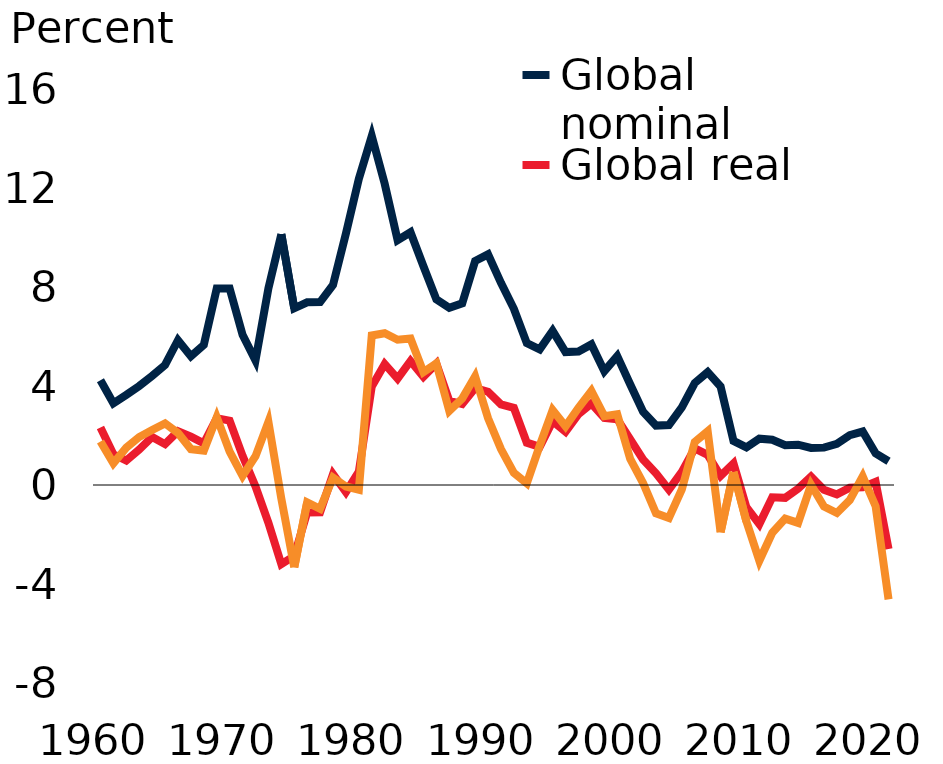
| Category | Global nominal | Global real | U.S. real |
|---|---|---|---|
| 1960.0 | 4.23 | 2.32 | 1.76 |
| 1961.0 | 3.3 | 1.24 | 0.88 |
| 1962.0 | 3.64 | 0.99 | 1.51 |
| 1963.0 | 4 | 1.43 | 1.94 |
| 1964.0 | 4.41 | 1.94 | 2.22 |
| 1965.0 | 4.85 | 1.65 | 2.49 |
| 1966.0 | 5.85 | 2.17 | 2.1 |
| 1967.0 | 5.2 | 1.95 | 1.45 |
| 1968.0 | 5.66 | 1.68 | 1.39 |
| 1969.0 | 7.94 | 2.7 | 2.74 |
| 1970.0 | 7.94 | 2.6 | 1.35 |
| 1971.0 | 6.07 | 1.18 | 0.37 |
| 1972.0 | 5.03 | -0.06 | 1.16 |
| 1973.0 | 7.95 | -1.53 | 2.55 |
| 1974.0 | 10.13 | -3.2 | -0.55 |
| 1975.0 | 7.14 | -2.87 | -3.32 |
| 1976.0 | 7.38 | -1.11 | -0.7 |
| 1977.0 | 7.39 | -1.1 | -0.96 |
| 1978.0 | 8.08 | 0.44 | 0.3 |
| 1979.0 | 10.16 | -0.29 | -0.06 |
| 1980.0 | 12.37 | 0.54 | -0.19 |
| 1981.0 | 14.1 | 3.98 | 6.04 |
| 1982.0 | 12.17 | 4.89 | 6.13 |
| 1983.0 | 9.89 | 4.3 | 5.87 |
| 1984.0 | 10.21 | 5.01 | 5.92 |
| 1985.0 | 8.84 | 4.37 | 4.56 |
| 1986.0 | 7.5 | 4.9 | 4.91 |
| 1987.0 | 7.16 | 3.4 | 2.99 |
| 1988.0 | 7.34 | 3.27 | 3.49 |
| 1989.0 | 9.05 | 3.92 | 4.39 |
| 1990.0 | 9.32 | 3.77 | 2.7 |
| 1991.0 | 8.17 | 3.26 | 1.45 |
| 1992.0 | 7.12 | 3.12 | 0.49 |
| 1993.0 | 5.73 | 1.71 | 0.07 |
| 1994.0 | 5.48 | 1.54 | 1.59 |
| 1995.0 | 6.23 | 2.58 | 3.03 |
| 1996.0 | 5.37 | 2.15 | 2.37 |
| 1997.0 | 5.39 | 2.86 | 3.12 |
| 1998.0 | 5.68 | 3.29 | 3.8 |
| 1999.0 | 4.6 | 2.71 | 2.78 |
| 2000.0 | 5.21 | 2.66 | 2.86 |
| 2001.0 | 4.07 | 1.85 | 1.06 |
| 2002.0 | 2.96 | 1.03 | 0.08 |
| 2003.0 | 2.4 | 0.47 | -1.14 |
| 2004.0 | 2.42 | -0.19 | -1.33 |
| 2005.0 | 3.14 | 0.53 | -0.18 |
| 2006.0 | 4.12 | 1.48 | 1.74 |
| 2007.0 | 4.56 | 1.22 | 2.17 |
| 2008.0 | 3.98 | 0.37 | -1.91 |
| 2009.0 | 1.78 | 0.87 | 0.52 |
| 2010.0 | 1.52 | -0.9 | -1.47 |
| 2011.0 | 1.87 | -1.58 | -3.06 |
| 2012.0 | 1.83 | -0.5 | -1.93 |
| 2013.0 | 1.61 | -0.52 | -1.36 |
| 2014.0 | 1.63 | -0.15 | -1.53 |
| 2015.0 | 1.5 | 0.34 | 0.01 |
| 2016.0 | 1.51 | -0.19 | -0.87 |
| 2017.0 | 1.66 | -0.38 | -1.13 |
| 2018.0 | 2.01 | -0.11 | -0.61 |
| 2019.0 | 2.16 | -0.09 | 0.35 |
| 2020.0 | 1.28 | 0.13 | -0.86 |
| 2021.0 | 0.96 | -2.59 | -4.62 |